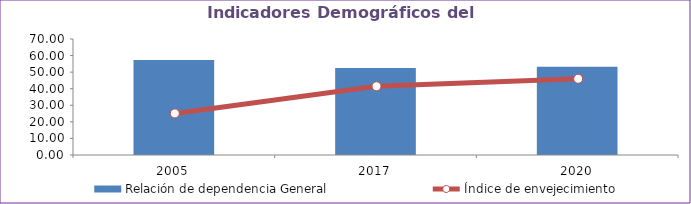
| Category | Relación de dependencia General |
|---|---|
| 2005.0 | 57.401 |
| 2017.0 | 52.435 |
| 2020.0 | 53.324 |